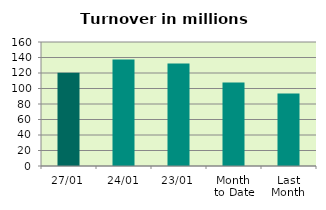
| Category | Series 0 |
|---|---|
| 27/01 | 120.412 |
| 24/01 | 137.313 |
| 23/01 | 132.272 |
| Month 
to Date | 107.699 |
| Last
Month | 93.592 |